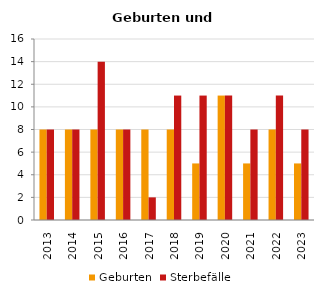
| Category | Geburten | Sterbefälle |
|---|---|---|
| 2013.0 | 8 | 8 |
| 2014.0 | 8 | 8 |
| 2015.0 | 8 | 14 |
| 2016.0 | 8 | 8 |
| 2017.0 | 8 | 2 |
| 2018.0 | 8 | 11 |
| 2019.0 | 5 | 11 |
| 2020.0 | 11 | 11 |
| 2021.0 | 5 | 8 |
| 2022.0 | 8 | 11 |
| 2023.0 | 5 | 8 |